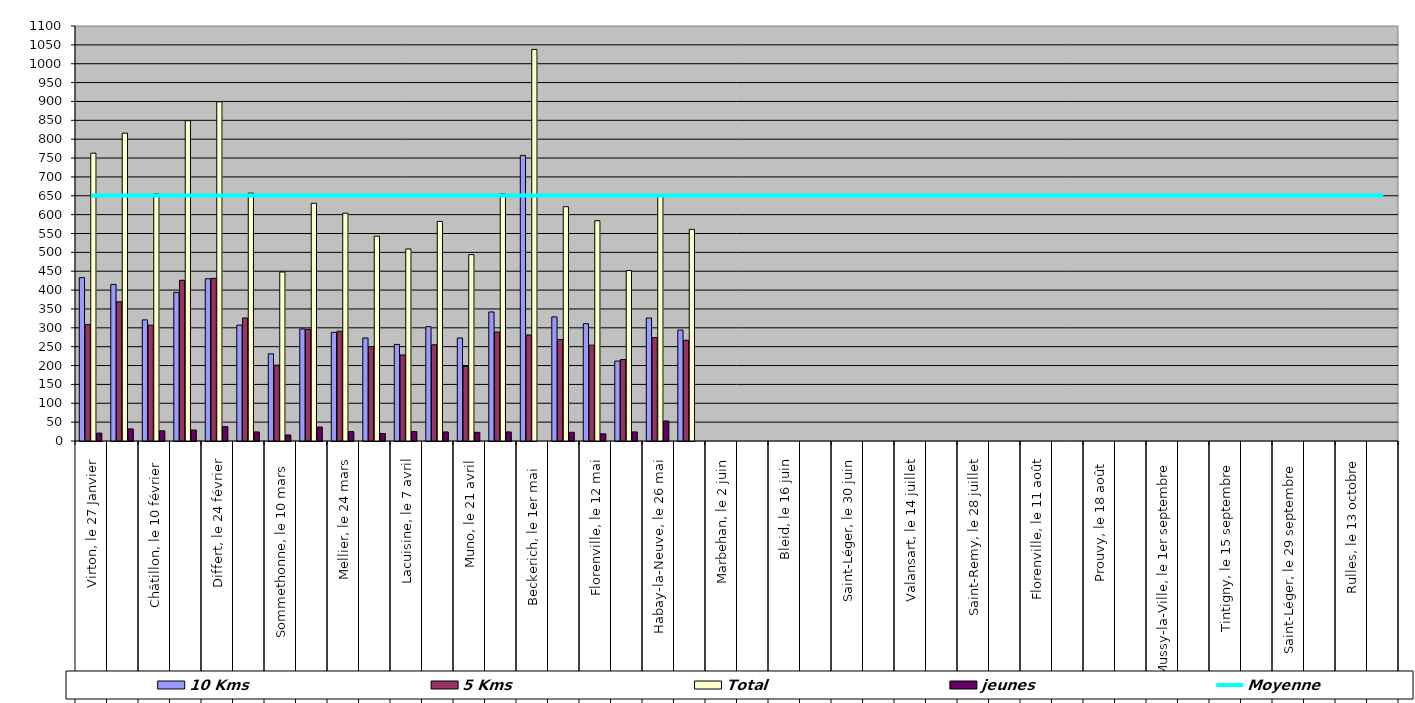
| Category | 10 Kms | 5 Kms | Total | jeunes |
|---|---|---|---|---|
| 0 | 433 | 309 | 763 | 21 |
| 1 | 415 | 369 | 816 | 32 |
| 2 | 321 | 307 | 655 | 27 |
| 3 | 394 | 426 | 849 | 29 |
| 4 | 430 | 431 | 899 | 38 |
| 5 | 307 | 326 | 657 | 24 |
| 6 | 231 | 201 | 448 | 16 |
| 7 | 297 | 296 | 630 | 37 |
| 8 | 288 | 291 | 604 | 25 |
| 9 | 273 | 250 | 543 | 20 |
| 10 | 256 | 228 | 509 | 25 |
| 11 | 303 | 255 | 582 | 24 |
| 12 | 273 | 198 | 494 | 23 |
| 13 | 342 | 289 | 655 | 24 |
| 14 | 757 | 281 | 1038 | 0 |
| 15 | 329 | 269 | 621 | 23 |
| 16 | 311 | 254 | 584 | 19 |
| 17 | 212 | 216 | 452 | 24 |
| 18 | 326 | 274 | 653 | 53 |
| 19 | 294 | 267 | 561 | 0 |
| 20 | 0 | 0 | 0 | 0 |
| 21 | 0 | 0 | 0 | 0 |
| 22 | 0 | 0 | 0 | 0 |
| 23 | 0 | 0 | 0 | 0 |
| 24 | 0 | 0 | 0 | 0 |
| 25 | 0 | 0 | 0 | 0 |
| 26 | 0 | 0 | 0 | 0 |
| 27 | 0 | 0 | 0 | 0 |
| 28 | 0 | 0 | 0 | 0 |
| 29 | 0 | 0 | 0 | 0 |
| 30 | 0 | 0 | 0 | 0 |
| 31 | 0 | 0 | 0 | 0 |
| 32 | 0 | 0 | 0 | 0 |
| 33 | 0 | 0 | 0 | 0 |
| 34 | 0 | 0 | 0 | 0 |
| 35 | 0 | 0 | 0 | 0 |
| 36 | 0 | 0 | 0 | 0 |
| 37 | 0 | 0 | 0 | 0 |
| 38 | 0 | 0 | 0 | 0 |
| 39 | 0 | 0 | 0 | 0 |
| 40 | 0 | 0 | 0 | 0 |
| 41 | 0 | 0 | 0 | 0 |